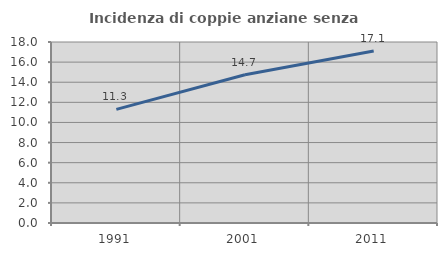
| Category | Incidenza di coppie anziane senza figli  |
|---|---|
| 1991.0 | 11.295 |
| 2001.0 | 14.747 |
| 2011.0 | 17.109 |